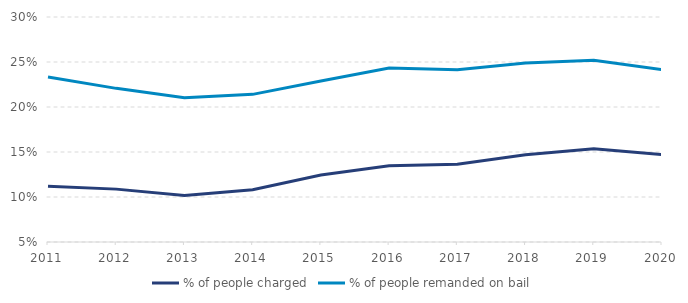
| Category | % of people charged | % of people remanded on bail |
|---|---|---|
| 2011.0 | 0.112 | 0.233 |
| 2012.0 | 0.109 | 0.221 |
| 2013.0 | 0.102 | 0.21 |
| 2014.0 | 0.108 | 0.214 |
| 2015.0 | 0.124 | 0.229 |
| 2016.0 | 0.135 | 0.243 |
| 2017.0 | 0.137 | 0.241 |
| 2018.0 | 0.147 | 0.249 |
| 2019.0 | 0.154 | 0.252 |
| 2020.0 | 0.147 | 0.242 |